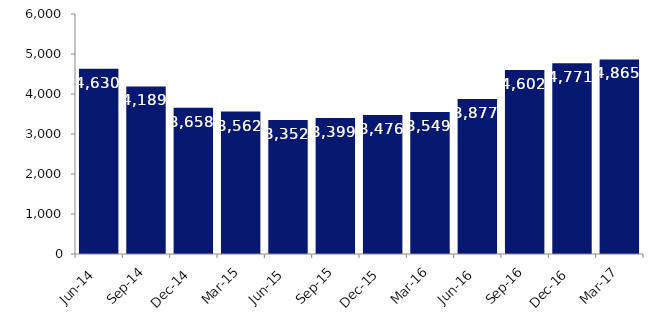
| Category | Series 0 |
|---|---|
| Jun-14 | 4630 |
| Sep-14 | 4189 |
| Dec-14 | 3658 |
| Mar-15 | 3562 |
| Jun-15 | 3352 |
| Sep-15 | 3399 |
| Dec-15 | 3476 |
| Mar-16 | 3549 |
| Jun-16 | 3877 |
| Sep-16 | 4602 |
| Dec-16 | 4771 |
| Mar-17 | 4865 |